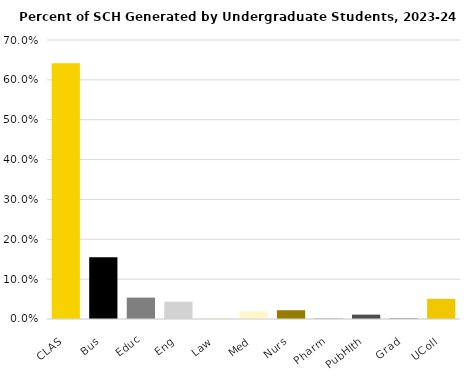
| Category | Series 0 |
|---|---|
| CLAS | 0.641 |
| Bus | 0.155 |
| Educ | 0.054 |
| Eng | 0.043 |
| Law | 0.001 |
| Med | 0.019 |
| Nurs | 0.022 |
| Pharm | 0.001 |
| PubHlth | 0.011 |
| Grad | 0.002 |
| UColl | 0.051 |